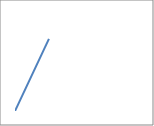
| Category | Series 0 |
|---|---|
| 0.0 | 0 |
| 2.7361611466053506 | 7.518 |